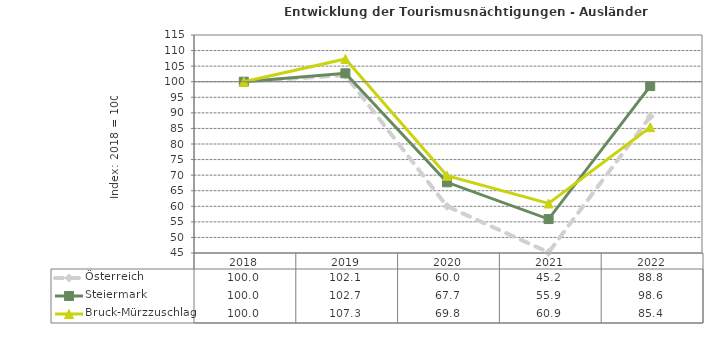
| Category | Österreich | Steiermark | Bruck-Mürzzuschlag |
|---|---|---|---|
| 2022.0 | 88.8 | 98.6 | 85.4 |
| 2021.0 | 45.2 | 55.9 | 60.9 |
| 2020.0 | 60 | 67.7 | 69.8 |
| 2019.0 | 102.1 | 102.7 | 107.3 |
| 2018.0 | 100 | 100 | 100 |